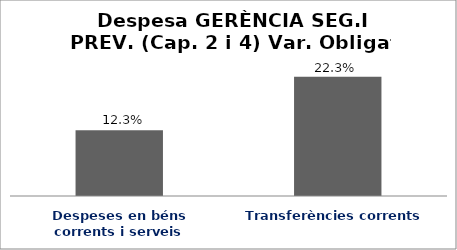
| Category | Series 0 |
|---|---|
| Despeses en béns corrents i serveis | 0.123 |
| Transferències corrents | 0.223 |